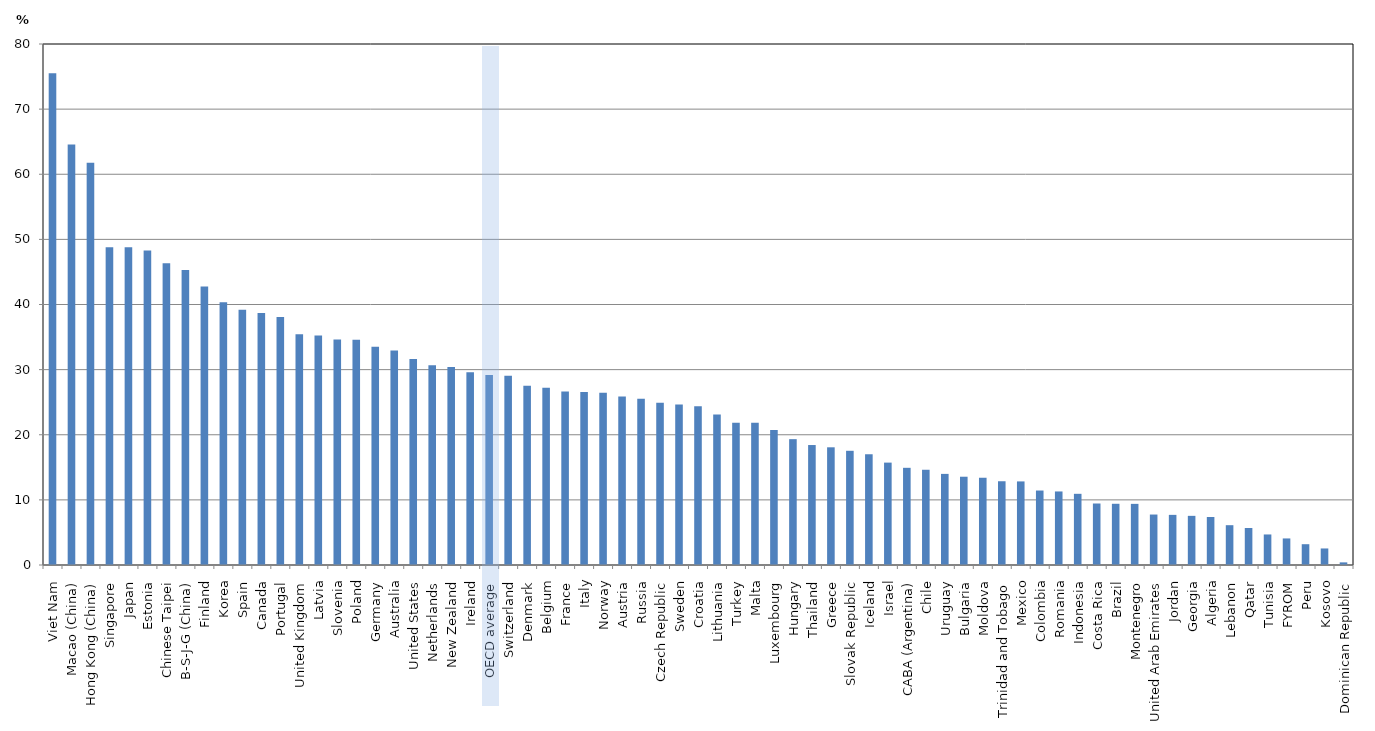
| Category | Percentage of resilient students |
|---|---|
| Viet Nam | 75.513 |
| Macao (China) | 64.577 |
| Hong Kong (China) | 61.755 |
| Singapore | 48.796 |
| Japan | 48.788 |
| Estonia | 48.283 |
| Chinese Taipei | 46.32 |
| B-S-J-G (China) | 45.289 |
| Finland | 42.758 |
| Korea | 40.356 |
| Spain | 39.18 |
| Canada | 38.71 |
| Portugal | 38.065 |
| United Kingdom | 35.44 |
| Latvia | 35.241 |
| Slovenia | 34.611 |
| Poland | 34.571 |
| Germany | 33.507 |
| Australia | 32.937 |
| United States | 31.623 |
| Netherlands | 30.687 |
| New Zealand | 30.403 |
| Ireland | 29.588 |
| OECD average | 29.182 |
| Switzerland | 29.069 |
| Denmark | 27.509 |
| Belgium | 27.208 |
| France | 26.65 |
| Italy | 26.553 |
| Norway | 26.468 |
| Austria | 25.892 |
| Russia | 25.542 |
| Czech Republic | 24.928 |
| Sweden | 24.654 |
| Croatia | 24.388 |
| Lithuania | 23.103 |
| Turkey | 21.835 |
| Malta | 21.831 |
| Luxembourg | 20.733 |
| Hungary | 19.323 |
| Thailand | 18.421 |
| Greece | 18.072 |
| Slovak Republic | 17.536 |
| Iceland | 17.005 |
| Israel | 15.722 |
| CABA (Argentina) | 14.923 |
| Chile | 14.624 |
| Uruguay | 13.99 |
| Bulgaria | 13.555 |
| Moldova | 13.413 |
| Trinidad and Tobago | 12.86 |
| Mexico | 12.835 |
| Colombia | 11.436 |
| Romania | 11.293 |
| Indonesia | 10.931 |
| Costa Rica | 9.443 |
| Brazil | 9.4 |
| Montenegro | 9.387 |
| United Arab Emirates | 7.749 |
| Jordan | 7.698 |
| Georgia | 7.547 |
| Algeria | 7.372 |
| Lebanon | 6.113 |
| Qatar | 5.681 |
| Tunisia | 4.69 |
| FYROM | 4.079 |
| Peru | 3.194 |
| Kosovo | 2.54 |
| Dominican Republic | 0.403 |